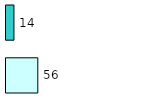
| Category | Series 0 | Series 1 |
|---|---|---|
| 0 | 56 | 14 |